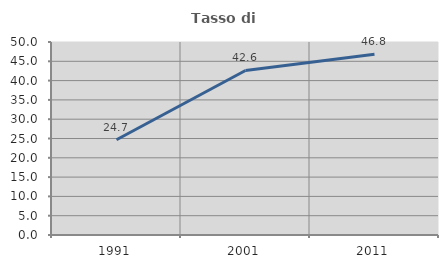
| Category | Tasso di occupazione   |
|---|---|
| 1991.0 | 24.675 |
| 2001.0 | 42.623 |
| 2011.0 | 46.809 |